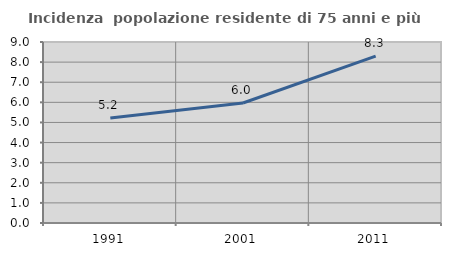
| Category | Incidenza  popolazione residente di 75 anni e più |
|---|---|
| 1991.0 | 5.218 |
| 2001.0 | 5.966 |
| 2011.0 | 8.297 |